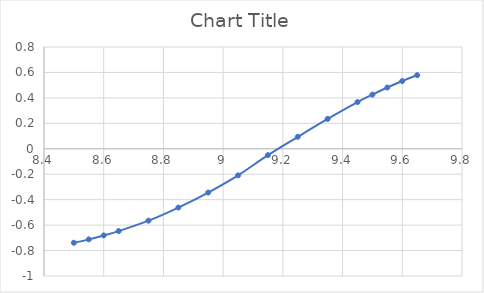
| Category | Series 0 |
|---|---|
| 8.5 | -0.739 |
| 8.55 | -0.712 |
| 8.6 | -0.681 |
| 8.65 | -0.647 |
| 8.75 | -0.565 |
| 8.85 | -0.462 |
| 8.95 | -0.344 |
| 9.05 | -0.209 |
| 9.15 | -0.05 |
| 9.25 | 0.094 |
| 9.35 | 0.235 |
| 9.45 | 0.367 |
| 9.5 | 0.426 |
| 9.55 | 0.482 |
| 9.6 | 0.532 |
| 9.65 | 0.578 |